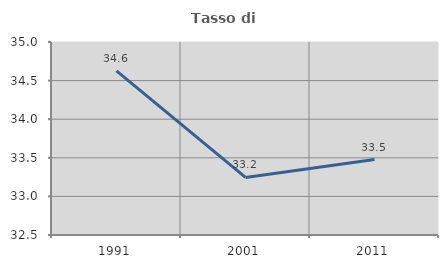
| Category | Tasso di occupazione   |
|---|---|
| 1991.0 | 34.627 |
| 2001.0 | 33.246 |
| 2011.0 | 33.477 |